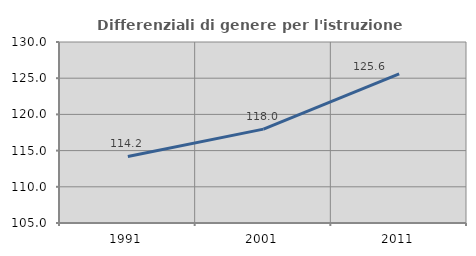
| Category | Differenziali di genere per l'istruzione superiore |
|---|---|
| 1991.0 | 114.195 |
| 2001.0 | 117.967 |
| 2011.0 | 125.585 |